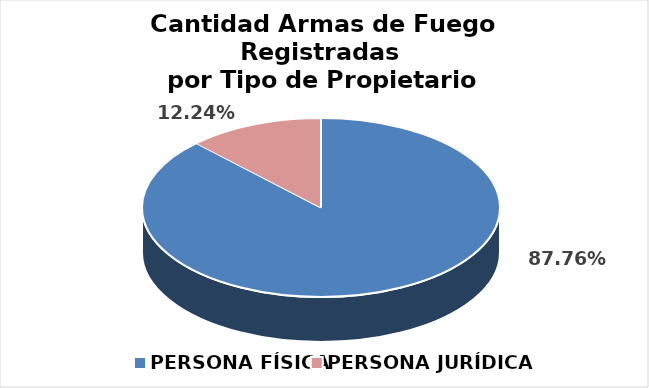
| Category | Series 0 |
|---|---|
| PERSONA FÍSICA | 0.878 |
| PERSONA JURÍDICA | 0.122 |